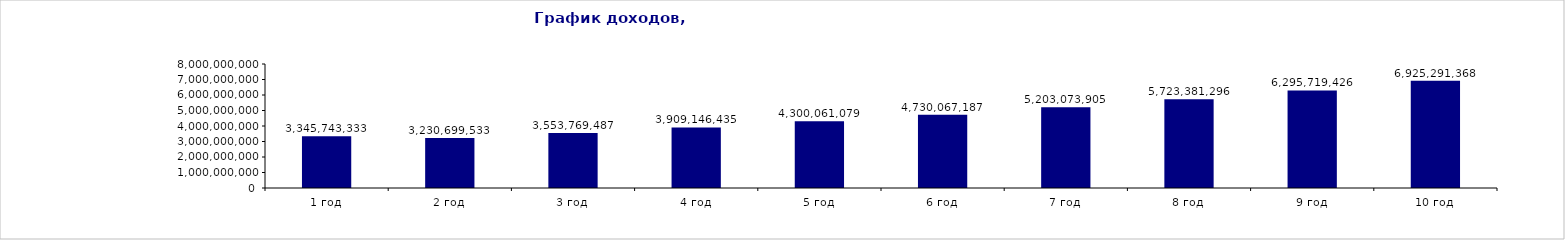
| Category | ИТОГО |
|---|---|
| 1 год | 3345743333.333 |
| 2 год | 3230699533.333 |
| 3 год | 3553769486.667 |
| 4 год | 3909146435.333 |
| 5 год | 4300061078.867 |
| 6 год | 4730067186.753 |
| 7 год | 5203073905.429 |
| 8 год | 5723381295.972 |
| 9 год | 6295719425.569 |
| 10 год | 6925291368.126 |